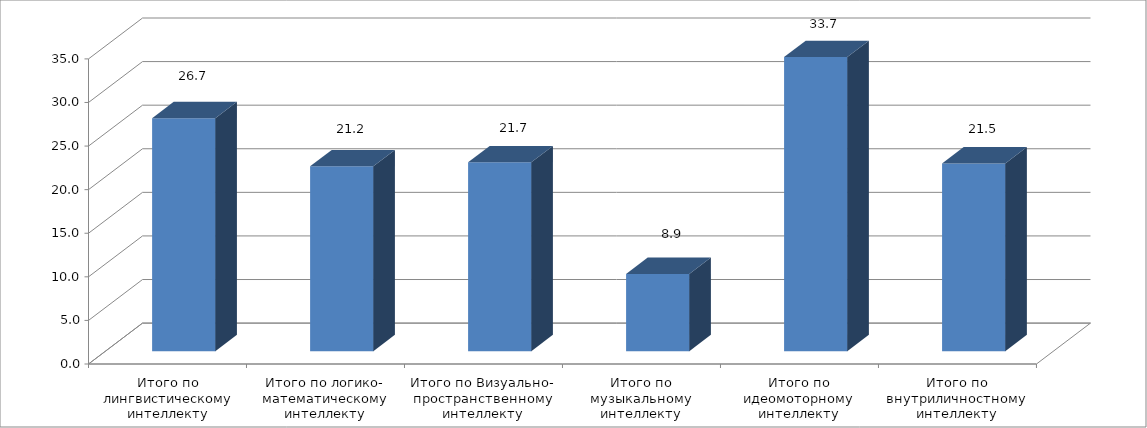
| Category | Series 0 |
|---|---|
| Итого по лингвистическому интеллекту | 26.733 |
| Итого по логико- математическому интеллекту | 21.2 |
| Итого по Визуально- пространственному интеллекту | 21.667 |
| Итого по музыкальному интеллекту | 8.867 |
| Итого по идеомоторному интеллекту | 33.733 |
| Итого по внутриличностному интеллекту | 21.533 |